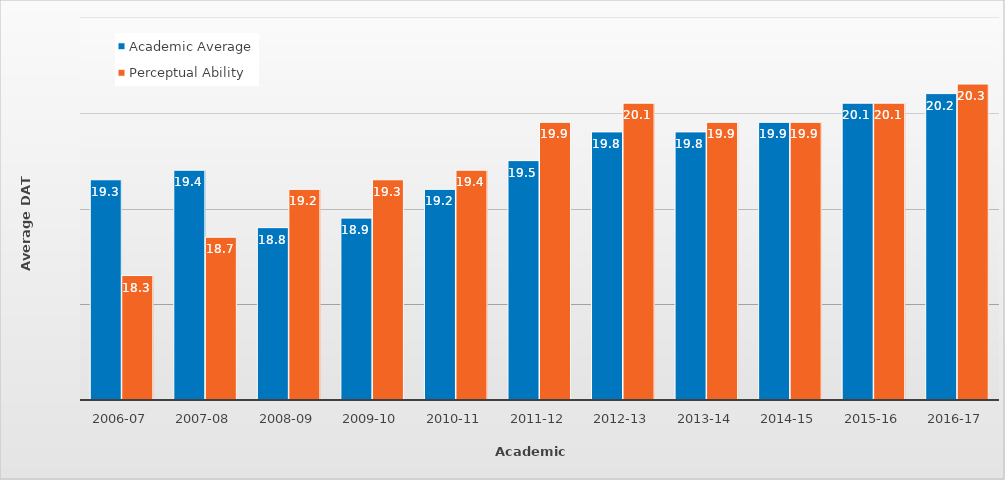
| Category | Academic Average | Perceptual Ability |
|---|---|---|
| 2006-07 | 19.3 | 18.3 |
| 2007-08 | 19.4 | 18.7 |
| 2008-09 | 18.8 | 19.2 |
| 2009-10 | 18.9 | 19.3 |
| 2010-11 | 19.2 | 19.4 |
| 2011-12 | 19.5 | 19.9 |
| 2012-13 | 19.8 | 20.1 |
| 2013-14 | 19.8 | 19.9 |
| 2014-15 | 19.9 | 19.9 |
| 2015-16 | 20.1 | 20.1 |
| 2016-17 | 20.2 | 20.3 |